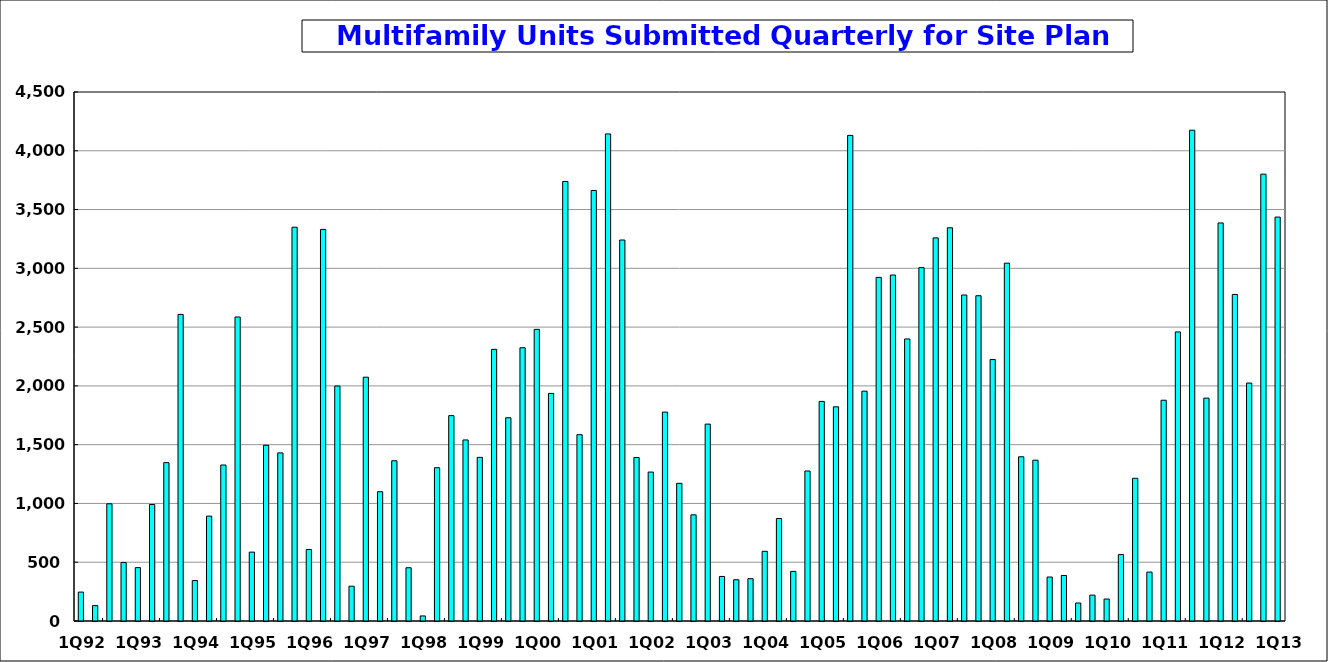
| Category | Series 0 |
|---|---|
| 1Q92 | 246 |
| 2Q92 | 131 |
| 3Q92 | 997 |
| 4Q92 | 498 |
| 1Q93 | 454 |
| 2Q93 | 991 |
| 3Q93 | 1347 |
| 4Q93 | 2608 |
| 1Q94 | 344 |
| 2Q94 | 892 |
| 3Q94 | 1327 |
| 4Q94 | 2586 |
| 1Q95 | 586 |
| 2Q95 | 1495 |
| 3Q95 | 1430 |
| 4Q95 | 3350 |
| 1Q96 | 608 |
| 2Q96 | 3331 |
| 3Q96 | 1999 |
| 4Q96 | 296 |
| 1Q97 | 2074 |
| 2Q97 | 1100 |
| 3Q97 | 1363 |
| 4Q97 | 453 |
| 1Q98 | 43 |
| 2Q98 | 1304 |
| 3Q98 | 1747 |
| 4Q98 | 1540 |
| 1Q99 | 1392 |
| 2Q99 | 2311 |
| 3Q99 | 1729 |
| 4Q99 | 2324.56 |
| 1Q00 | 2481 |
| 2Q00 | 1936 |
| 3Q00 | 3739 |
| 4Q00 | 1585 |
| 1Q01 | 3662 |
| 2Q01 | 4143 |
| 3Q01 | 3241 |
| 4Q01 | 1391 |
| 1Q02 | 1267 |
| 2Q02 | 1777 |
| 3Q02 | 1171 |
| 4Q02 | 903 |
| 1Q03 | 1675 |
| 2Q03 | 379 |
| 3Q03 | 351 |
| 4Q03 | 360 |
| 1Q04 | 593 |
| 2Q04 | 872 |
| 3Q04 | 422 |
| 4Q04 | 1276 |
| 1Q05 | 1868 |
| 2Q05 | 1822 |
| 3Q05 | 4131 |
| 4Q05 | 1955 |
| 1Q06 | 2923 |
| 2Q06 | 2943 |
| 3Q06 | 2399 |
| 4Q06 | 3006 |
| 1Q07 | 3259 |
| 2Q07 | 3345 |
| 3Q07 | 2773 |
| 4Q07 | 2767 |
| 1Q08 | 2224 |
| 2Q08 | 3044 |
| 3Q08 | 1397 |
| 4Q08 | 1368 |
| 1Q09 | 374 |
| 2Q09 | 387 |
| 3Q09 | 153 |
| 4Q09 | 220 |
| 1Q10 | 187 |
| 2Q10 | 565 |
| 3Q10 | 1214 |
| 4Q10 | 416 |
| 1Q11 | 1878 |
| 2Q11 | 2459 |
| 3Q11 | 4175 |
| 4Q11 | 1896 |
| 1Q12 | 3386 |
| 2Q12 | 2778 |
| 3Q12 | 2024 |
| 4Q12 | 3801 |
| 1Q13 | 3436 |